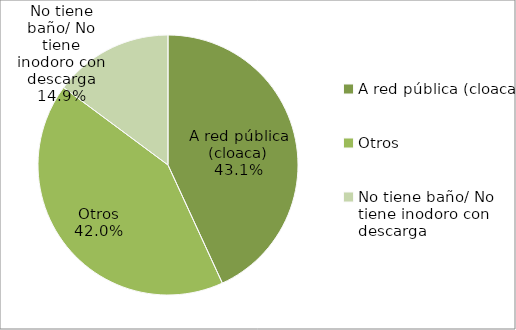
| Category | Series 0 |
|---|---|
| A red pública (cloaca) | 43.136 |
| Otros | 42.025 |
| No tiene baño/ No tiene inodoro con descarga | 14.839 |